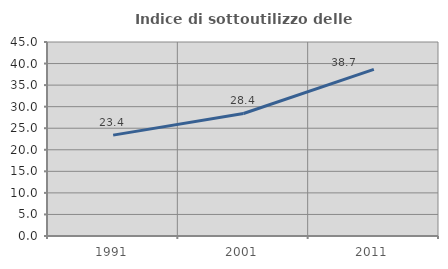
| Category | Indice di sottoutilizzo delle abitazioni  |
|---|---|
| 1991.0 | 23.4 |
| 2001.0 | 28.425 |
| 2011.0 | 38.663 |